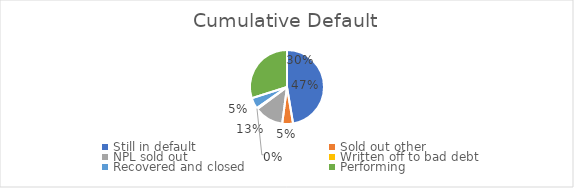
| Category | Series 0 |
|---|---|
| Still in default | 0.474 |
| Sold out other | 0.047 |
| NPL sold out | 0.128 |
| Written off to bad debt | 0.004 |
| Recovered and closed | 0.048 |
| Performing | 0.299 |